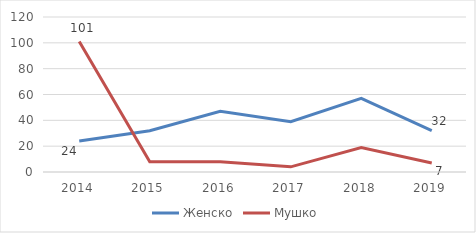
| Category | Женско | Мушко |
|---|---|---|
| 2014.0 | 24 | 101 |
| 2015.0 | 32 | 8 |
| 2016.0 | 47 | 8 |
| 2017.0 | 39 | 4 |
| 2018.0 | 57 | 19 |
| 2019.0 | 32 | 7 |